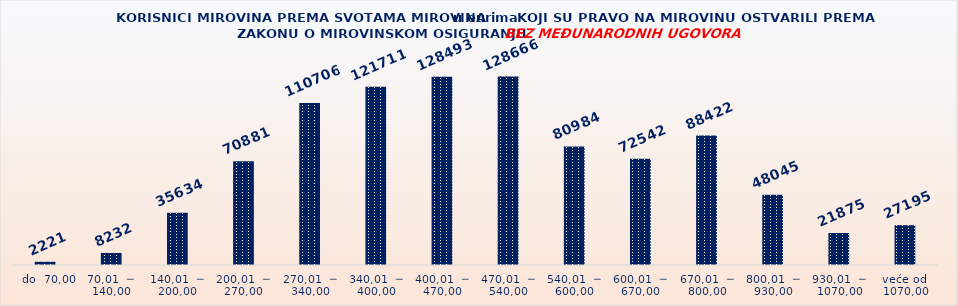
| Category | KORISNICI MIROVINA PREMA VRSTAMA I SVOTAMA MIROVINA KOJI SU PRAVO NA MIROVINU OSTVARILI PREMA ZAKONU O MIROVINSKOM OSIGURANJU 
BEZ MEĐUNARODNIH UGOVORA |
|---|---|
|   do  70,00 | 2221 |
| 70,01  ─  140,00 | 8232 |
| 140,01  ─  200,00 | 35634 |
| 200,01  ─  270,00 | 70881 |
| 270,01  ─  340,00 | 110706 |
| 340,01  ─  400,00 | 121711 |
| 400,01  ─  470,00 | 128493 |
| 470,01  ─  540,00 | 128666 |
| 540,01  ─  600,00 | 80984 |
| 600,01  ─  670,00 | 72542 |
| 670,01  ─  800,00 | 88422 |
| 800,01  ─  930,00 | 48045 |
| 930,01  ─  1070,00 | 21875 |
| veće od  1070,00 | 27195 |